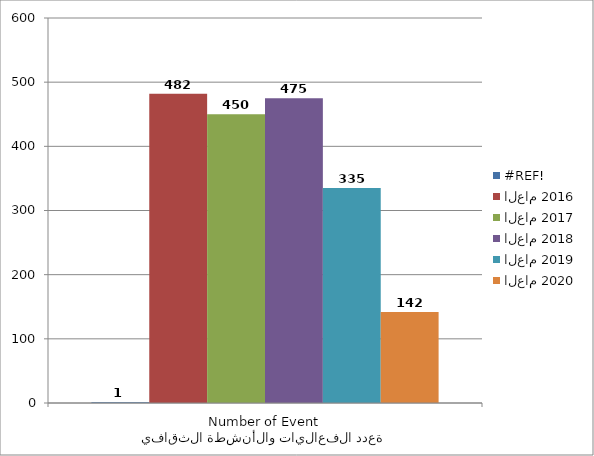
| Category | #REF! | العام 2016 | العام 2017 | العام 2018 | العام 2019 | العام 2020 |
|---|---|---|---|---|---|---|
| عدد الفعاليات والأنشطة الثقافية
Number of Events | 1 | 482 | 450 | 475 | 335 | 142 |